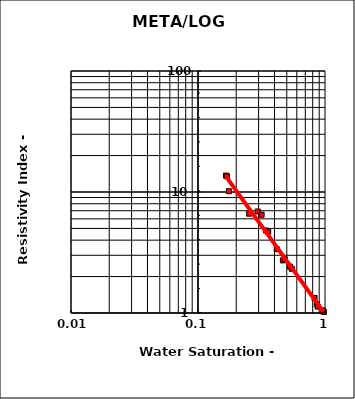
| Category | Series 0 |
|---|---|
| 0.466 | 2.72 |
| 0.529 | 2.42 |
| 0.861 | 1.18 |
| 0.295 | 6.9 |
| 0.317 | 6.49 |
| 0.343 | 4.81 |
| 0.417 | 3.37 |
| 0.548 | 2.32 |
| 0.877 | 1.13 |
| 0.979 | 1.02 |
| 0.166 | 13.66 |
| 0.169 | 13.48 |
| 0.175 | 10.15 |
| 0.253 | 6.62 |
| 0.357 | 4.7 |
| 0.482 | 2.785 |
| 0.827 | 1.33 |
| 0.962 | 1.05 |